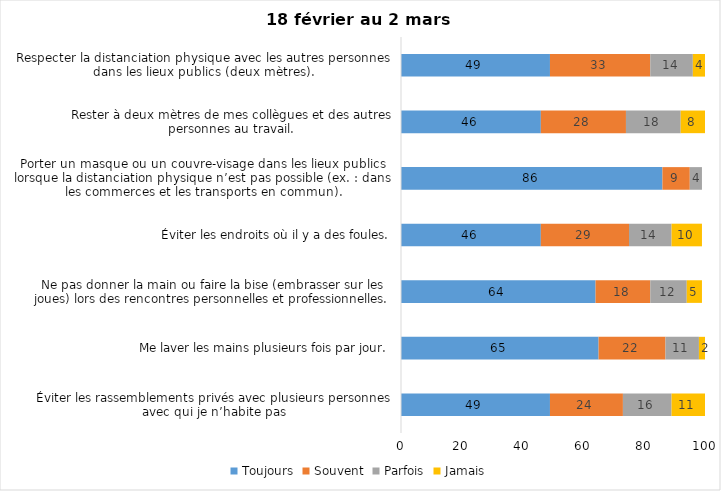
| Category | Toujours | Souvent | Parfois | Jamais |
|---|---|---|---|---|
| Éviter les rassemblements privés avec plusieurs personnes avec qui je n’habite pas | 49 | 24 | 16 | 11 |
| Me laver les mains plusieurs fois par jour. | 65 | 22 | 11 | 2 |
| Ne pas donner la main ou faire la bise (embrasser sur les joues) lors des rencontres personnelles et professionnelles. | 64 | 18 | 12 | 5 |
| Éviter les endroits où il y a des foules. | 46 | 29 | 14 | 10 |
| Porter un masque ou un couvre-visage dans les lieux publics lorsque la distanciation physique n’est pas possible (ex. : dans les commerces et les transports en commun). | 86 | 9 | 4 | 0 |
| Rester à deux mètres de mes collègues et des autres personnes au travail. | 46 | 28 | 18 | 8 |
| Respecter la distanciation physique avec les autres personnes dans les lieux publics (deux mètres). | 49 | 33 | 14 | 4 |